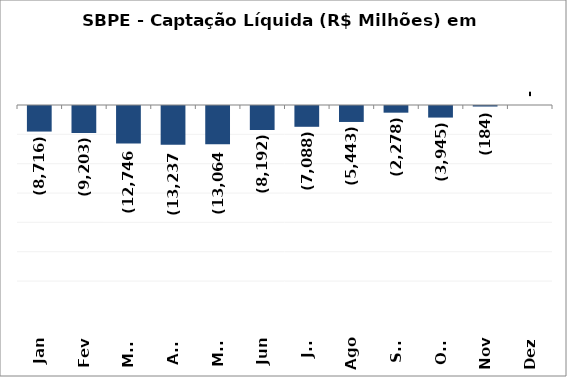
| Category | SBPE - Captação Líquida (R$ Milhões) em 2017 |
|---|---|
| Jan | -8715.686 |
| Fev | -9202.67 |
| Mar | -12745.527 |
| Abr | -13236.696 |
| Mai | -13064.126 |
| Jun | -8192.167 |
| Jul | -7088.276 |
| Ago | -5443.181 |
| Set | -2277.785 |
| Out | -3945.397 |
| Nov | -183.687 |
| Dez | 0 |